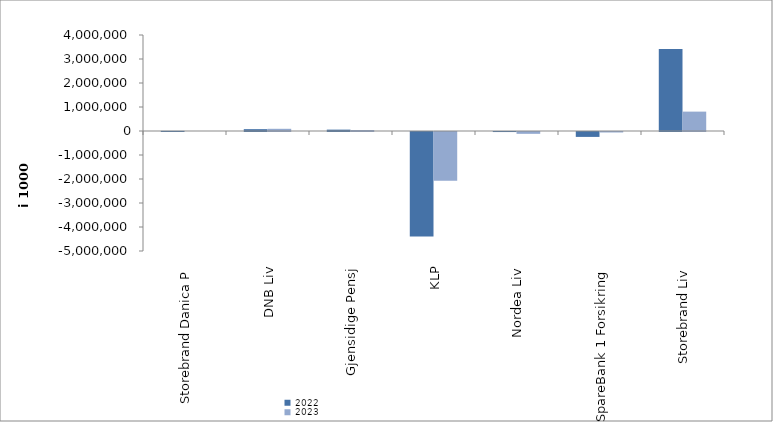
| Category | 2022 | 2023 |
|---|---|---|
| Storebrand Danica P | 5339.348 | 0 |
| DNB Liv | 76914 | 91539 |
| Gjensidige Pensj | 57086 | 40752 |
| KLP | -4355080.076 | -2030079.185 |
| Nordea Liv | -1840.417 | -76424.285 |
| SpareBank 1 Forsikring | -204444.928 | -20356.492 |
| Storebrand Liv | 3416282.855 | 807546.029 |